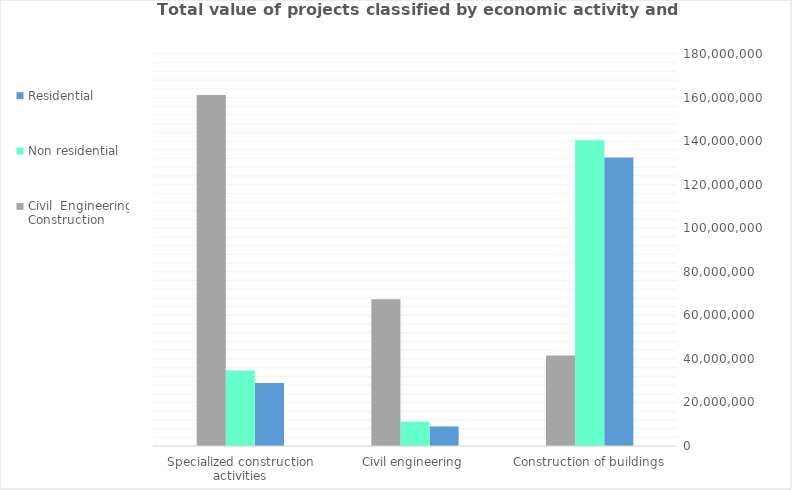
| Category |  Residential  |  Non residential  |  Civil  Engineering Construction  |
|---|---|---|---|
| Construction of buildings | 132492562.662 | 140414156.351 | 41524587.987 |
| Civil engineering | 8986002.508 | 11193301.766 | 67434882.726 |
| Specialized construction activities | 28963155.151 | 34625267.5 | 161157437.348 |